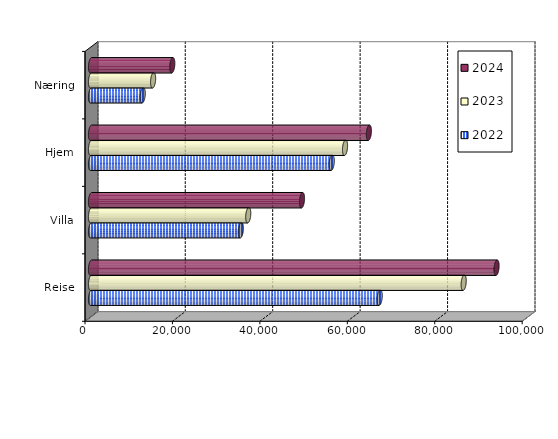
| Category | 2022 | 2023 | 2024 |
|---|---|---|---|
| Reise | 66033.365 | 85249 | 92765.109 |
| Villa | 34271.79 | 35963.895 | 48264.132 |
| Hjem | 55060.822 | 58109 | 63559.629 |
| Næring | 11825.086 | 14204.682 | 18591.561 |